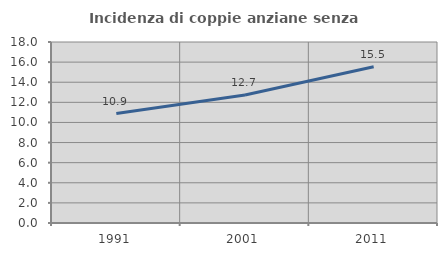
| Category | Incidenza di coppie anziane senza figli  |
|---|---|
| 1991.0 | 10.883 |
| 2001.0 | 12.732 |
| 2011.0 | 15.547 |